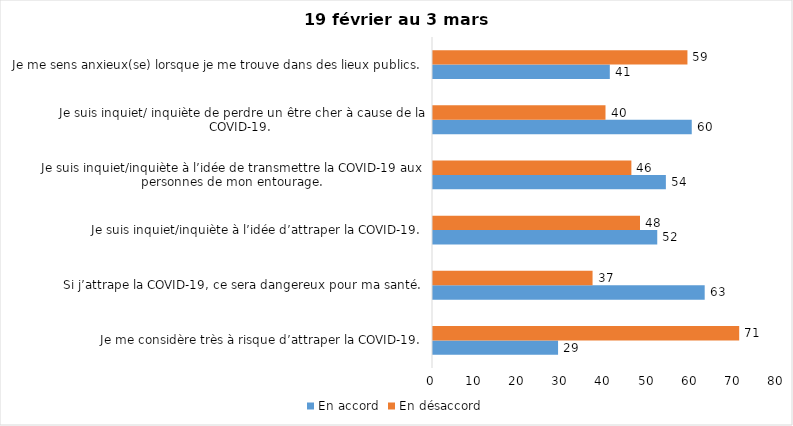
| Category | En accord | En désaccord |
|---|---|---|
| Je me considère très à risque d’attraper la COVID-19. | 29 | 71 |
| Si j’attrape la COVID-19, ce sera dangereux pour ma santé. | 63 | 37 |
| Je suis inquiet/inquiète à l’idée d’attraper la COVID-19. | 52 | 48 |
| Je suis inquiet/inquiète à l’idée de transmettre la COVID-19 aux personnes de mon entourage. | 54 | 46 |
| Je suis inquiet/ inquiète de perdre un être cher à cause de la COVID-19. | 60 | 40 |
| Je me sens anxieux(se) lorsque je me trouve dans des lieux publics. | 41 | 59 |